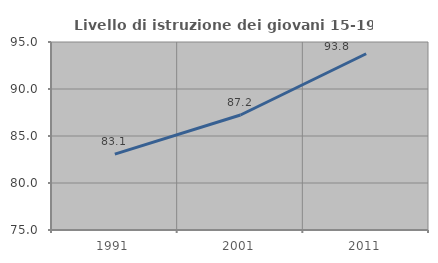
| Category | Livello di istruzione dei giovani 15-19 anni |
|---|---|
| 1991.0 | 83.077 |
| 2001.0 | 87.234 |
| 2011.0 | 93.75 |